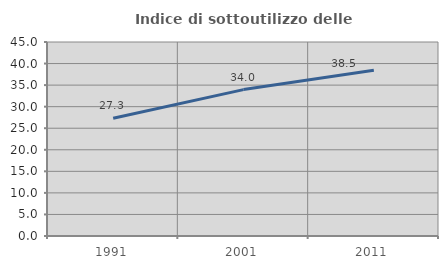
| Category | Indice di sottoutilizzo delle abitazioni  |
|---|---|
| 1991.0 | 27.322 |
| 2001.0 | 33.961 |
| 2011.0 | 38.47 |